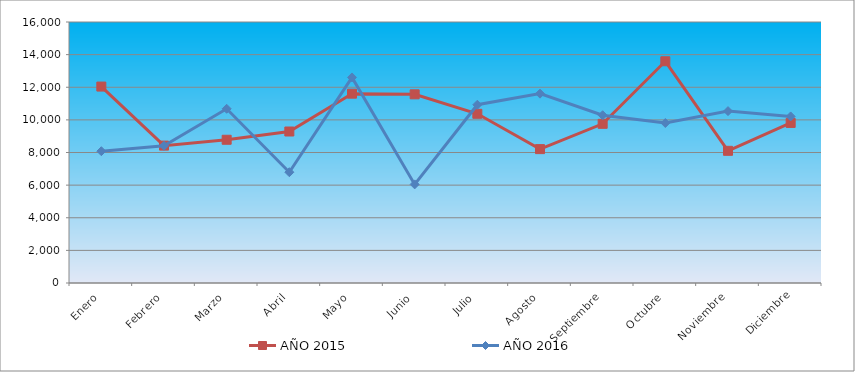
| Category | AÑO 2015 | AÑO 2016 |
|---|---|---|
| Enero | 12042.123 | 8080.309 |
| Febrero | 8421.765 | 8411.111 |
| Marzo | 8780.93 | 10680.947 |
| Abril | 9287.141 | 6791.493 |
| Mayo | 11606.64 | 12601.591 |
| Junio | 11566.069 | 6044.91 |
| Julio | 10373.444 | 10927.801 |
| Agosto | 8207.837 | 11608.155 |
| Septiembre | 9758.294 | 10283.573 |
| Octubre | 13592.597 | 9807.927 |
| Noviembre | 8102.771 | 10536.447 |
| Diciembre | 9812.725 | 10211.323 |